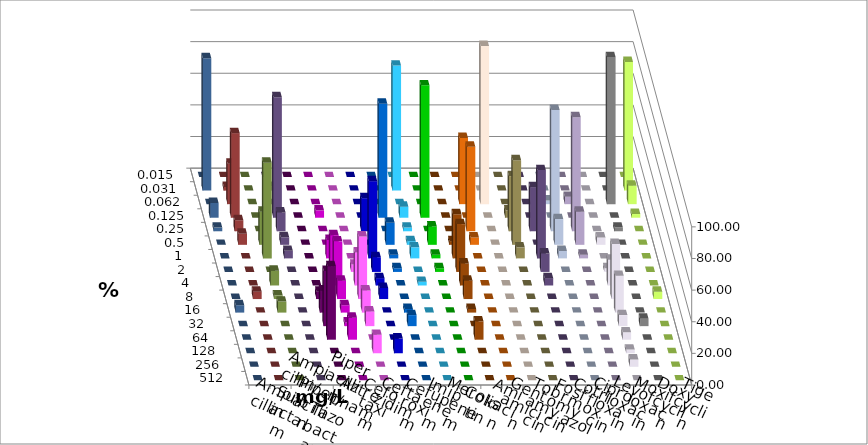
| Category | Ampicillin | Ampicillin/ Sulbactam | Piperacillin | Piperacillin/ Tazobactam | Aztreonam | Cefotaxim | Ceftazidim | Cefuroxim | Imipenem | Meropenem | Colistin | Amikacin | Gentamicin | Tobramycin | Fosfomycin | Cotrimoxazol | Ciprofloxacin | Levofloxacin | Moxifloxacin | Doxycyclin | Tigecyclin |
|---|---|---|---|---|---|---|---|---|---|---|---|---|---|---|---|---|---|---|---|---|---|
| 0.015 | 0 | 0 | 0 | 0 | 0 | 0 | 0 | 0 | 0 | 0 | 0 | 0 | 0 | 0 | 0 | 0 | 0 | 0 | 0 | 0 | 0 |
| 0.031 | 0 | 0 | 0 | 0 | 0 | 79.07 | 0 | 0 | 0 | 0 | 0 | 0 | 0 | 0 | 0 | 0 | 81.395 | 83.721 | 2.326 | 0 | 2.381 |
| 0.062 | 0 | 0 | 0 | 0 | 0 | 0 | 0 | 0 | 41.86 | 100 | 0 | 0 | 2.326 | 4.651 | 0 | 93.023 | 11.628 | 0 | 25.581 | 0 | 0 |
| 0.125 | 0 | 4.651 | 0 | 0 | 72.093 | 6.977 | 83.721 | 0 | 0 | 0 | 4.651 | 0 | 0 | 0 | 0 | 0 | 2.326 | 9.302 | 53.488 | 0 | 76.19 |
| 0.25 | 0 | 0 | 0 | 20.93 | 0 | 2.326 | 0 | 0 | 53.488 | 0 | 34.884 | 27.907 | 76.744 | 72.093 | 0 | 2.326 | 0 | 2.326 | 6.977 | 0 | 11.905 |
| 0.5 | 0 | 0 | 0 | 0 | 13.953 | 2.326 | 11.628 | 2.326 | 4.651 | 0 | 53.488 | 0 | 16.279 | 20.93 | 4.651 | 0 | 0 | 0 | 6.977 | 20.93 | 4.762 |
| 1.0 | 0 | 11.628 | 0 | 48.837 | 2.326 | 6.977 | 2.326 | 27.907 | 0 | 0 | 6.977 | 55.814 | 4.651 | 2.326 | 0 | 0 | 0 | 0 | 0 | 60.465 | 4.762 |
| 2.0 | 0 | 23.256 | 4.651 | 9.302 | 2.326 | 0 | 2.326 | 30.233 | 0 | 0 | 0 | 11.628 | 0 | 0 | 2.326 | 0 | 0 | 0 | 0 | 0 | 0 |
| 4.0 | 0 | 27.907 | 20.93 | 4.651 | 0 | 2.326 | 0 | 13.953 | 0 | 0 | 0 | 4.651 | 0 | 0 | 16.279 | 0 | 0 | 0 | 0 | 9.302 | 0 |
| 8.0 | 4.651 | 11.628 | 39.535 | 6.977 | 0 | 0 | 0 | 11.628 | 0 | 0 | 0 | 0 | 0 | 0 | 34.884 | 0 | 4.651 | 0 | 4.651 | 2.326 | 0 |
| 16.0 | 13.953 | 4.651 | 13.953 | 0 | 2.326 | 0 | 0 | 2.326 | 0 | 0 | 0 | 0 | 0 | 0 | 23.256 | 0 | 0 | 4.651 | 0 | 6.977 | 0 |
| 32.0 | 34.884 | 2.326 | 9.302 | 0 | 6.977 | 0 | 0 | 0 | 0 | 0 | 0 | 0 | 0 | 0 | 6.977 | 4.651 | 0 | 0 | 0 | 0 | 0 |
| 64.0 | 46.512 | 13.953 | 0 | 0 | 0 | 0 | 0 | 11.628 | 0 | 0 | 0 | 0 | 0 | 0 | 4.651 | 0 | 0 | 0 | 0 | 0 | 0 |
| 128.0 | 0 | 0 | 11.628 | 9.302 | 0 | 0 | 0 | 0 | 0 | 0 | 0 | 0 | 0 | 0 | 2.326 | 0 | 0 | 0 | 0 | 0 | 0 |
| 256.0 | 0 | 0 | 0 | 0 | 0 | 0 | 0 | 0 | 0 | 0 | 0 | 0 | 0 | 0 | 4.651 | 0 | 0 | 0 | 0 | 0 | 0 |
| 512.0 | 0 | 0 | 0 | 0 | 0 | 0 | 0 | 0 | 0 | 0 | 0 | 0 | 0 | 0 | 0 | 0 | 0 | 0 | 0 | 0 | 0 |